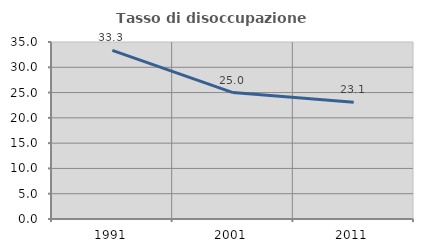
| Category | Tasso di disoccupazione giovanile  |
|---|---|
| 1991.0 | 33.333 |
| 2001.0 | 25 |
| 2011.0 | 23.077 |